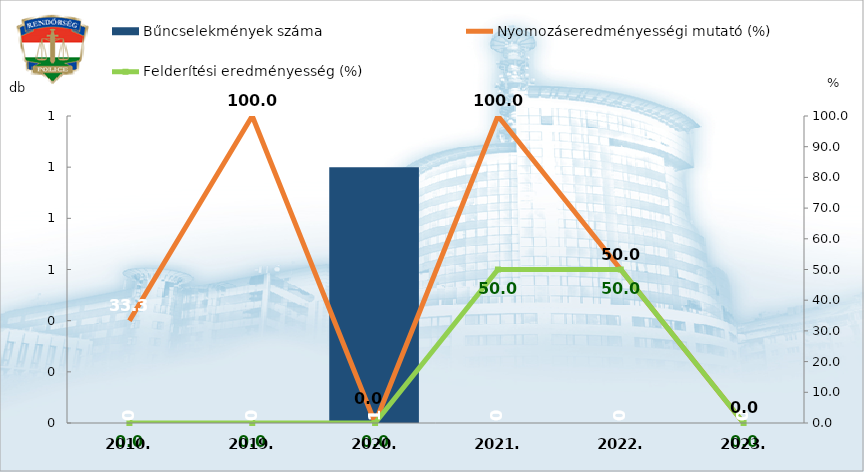
| Category | Bűncselekmények száma |
|---|---|
| 2010. | 0 |
| 2019. | 0 |
| 2020. | 1 |
| 2021. | 0 |
| 2022. | 0 |
| 2023. | 0 |